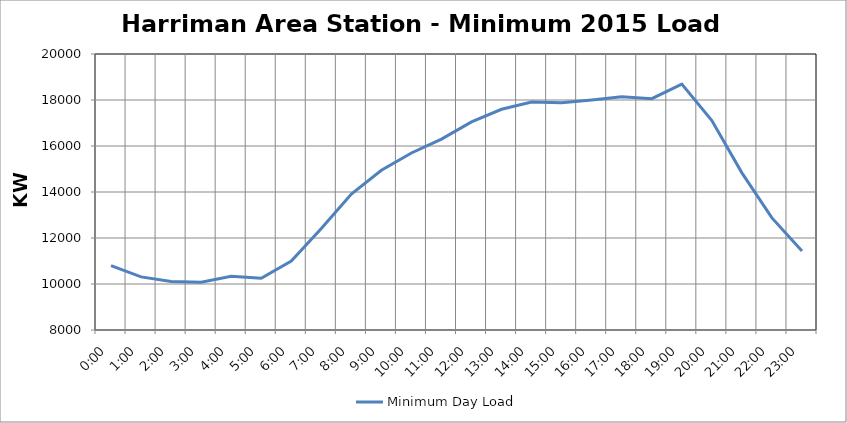
| Category | Minimum Day Load |
|---|---|
| 0.0 | 10800 |
| 0.041666666666666664 | 10310.4 |
| 0.08333333333333333 | 10108.8 |
| 0.125 | 10080 |
| 0.16666666666666666 | 10339.2 |
| 0.20833333333333334 | 10252.8 |
| 0.25 | 11001.6 |
| 0.2916666666666667 | 12412.8 |
| 0.3333333333333333 | 13910.4 |
| 0.375 | 14947.2 |
| 0.4166666666666667 | 15696 |
| 0.4583333333333333 | 16300.8 |
| 0.5 | 17049.6 |
| 0.5416666666666666 | 17596.8 |
| 0.5833333333333334 | 17913.6 |
| 0.625 | 17884.8 |
| 0.6666666666666666 | 18000 |
| 0.7083333333333334 | 18144 |
| 0.75 | 18057.6 |
| 0.7916666666666666 | 18691.2 |
| 0.8333333333333334 | 17107.2 |
| 0.875 | 14832 |
| 0.9166666666666666 | 12873.6 |
| 0.9583333333333334 | 11433.6 |